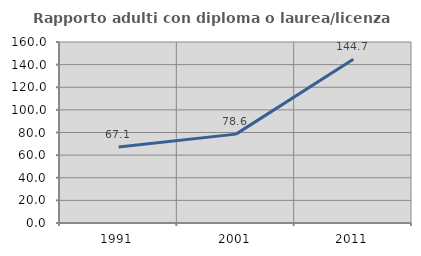
| Category | Rapporto adulti con diploma o laurea/licenza media  |
|---|---|
| 1991.0 | 67.143 |
| 2001.0 | 78.571 |
| 2011.0 | 144.706 |